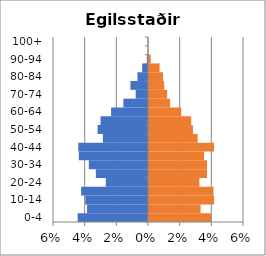
| Category | % Men | % Women |
|---|---|---|
| 0-4 | -0.044 | 0.039 |
| 5-9 | -0.039 | 0.033 |
| 10-14 | -0.04 | 0.041 |
| 15-19 | -0.042 | 0.041 |
| 20-24 | -0.027 | 0.032 |
| 25-29 | -0.033 | 0.037 |
| 30-34 | -0.037 | 0.037 |
| 35-39 | -0.044 | 0.035 |
| 40-44 | -0.044 | 0.041 |
| 45-49 | -0.029 | 0.031 |
| 50-54 | -0.032 | 0.028 |
| 55-59 | -0.03 | 0.027 |
| 60-64 | -0.023 | 0.02 |
| 65-69 | -0.016 | 0.013 |
| 70-74 | -0.008 | 0.011 |
| 75-79 | -0.011 | 0.01 |
| 80-84 | -0.007 | 0.009 |
| 85-89 | -0.004 | 0.007 |
| 90-94 | -0.001 | 0.001 |
| 95-99 | 0 | 0 |
| 100+ | 0 | 0 |